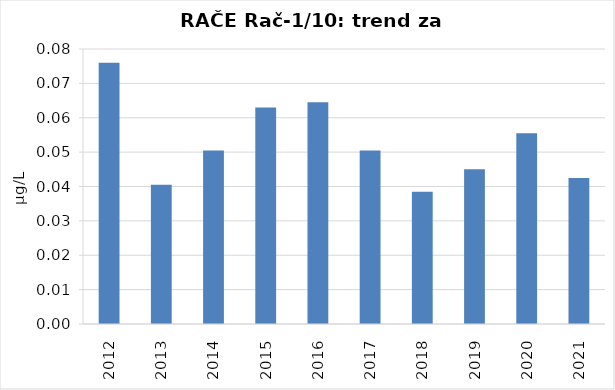
| Category | Vsota |
|---|---|
| 2012 | 0.076 |
| 2013 | 0.04 |
| 2014 | 0.05 |
| 2015 | 0.063 |
| 2016 | 0.064 |
| 2017 | 0.05 |
| 2018 | 0.038 |
| 2019 | 0.045 |
| 2020 | 0.056 |
| 2021 | 0.042 |